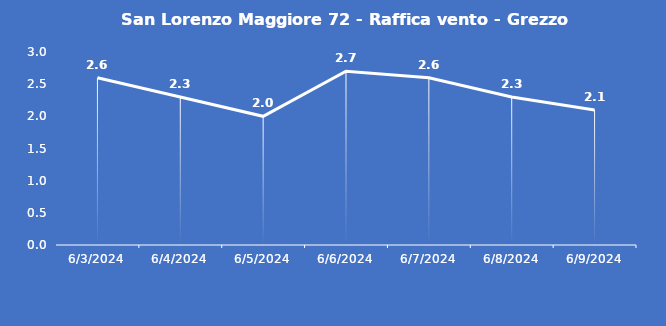
| Category | San Lorenzo Maggiore 72 - Raffica vento - Grezzo (m/s) |
|---|---|
| 6/3/24 | 2.6 |
| 6/4/24 | 2.3 |
| 6/5/24 | 2 |
| 6/6/24 | 2.7 |
| 6/7/24 | 2.6 |
| 6/8/24 | 2.3 |
| 6/9/24 | 2.1 |